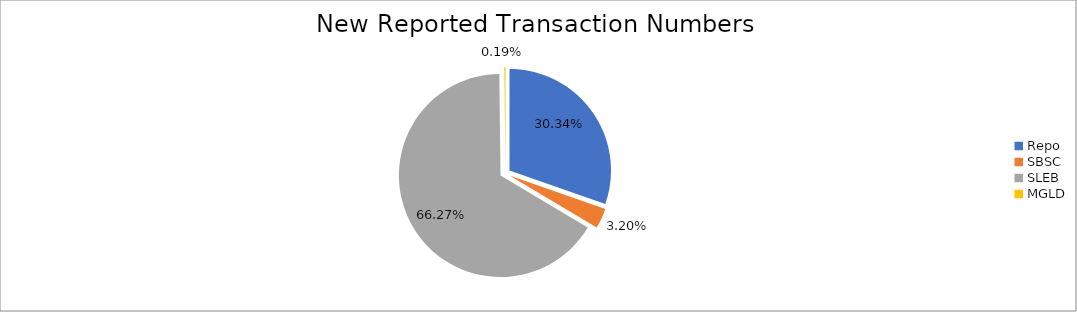
| Category | Series 0 |
|---|---|
| Repo | 407950 |
| SBSC | 42974 |
| SLEB | 890961 |
| MGLD | 2505 |